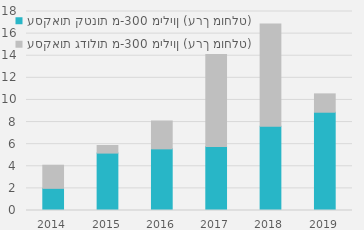
| Category | עסקאות קטנות מ-300 מיליון (ערך מוחלט) | עסקאות גדולות מ-300 מיליון (ערך מוחלט) |
|---|---|---|
| 2014.0 | 2003656 | 2091981 |
| 2015.0 | 5191989 | 688272 |
| 2016.0 | 5575646.84 | 2522521 |
| 2017.0 | 5794548 | 8310435 |
| 2018.0 | 7620515 | 9244919 |
| 2019.0 | 8890062 | 1658699 |